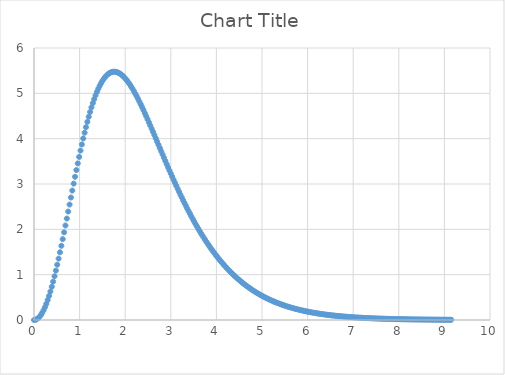
| Category | Series 0 |
|---|---|
| 0.0 | 0 |
| 0.03 | 0.004 |
| 0.06 | 0.017 |
| 0.09 | 0.039 |
| 0.12 | 0.07 |
| 0.15 | 0.11 |
| 0.18 | 0.159 |
| 0.21 | 0.216 |
| 0.24 | 0.282 |
| 0.27 | 0.357 |
| 0.30000000000000004 | 0.44 |
| 0.33000000000000007 | 0.53 |
| 0.3600000000000001 | 0.628 |
| 0.3900000000000001 | 0.734 |
| 0.42000000000000015 | 0.846 |
| 0.4500000000000002 | 0.965 |
| 0.4800000000000002 | 1.089 |
| 0.5100000000000002 | 1.219 |
| 0.5400000000000003 | 1.354 |
| 0.5700000000000003 | 1.494 |
| 0.6000000000000003 | 1.637 |
| 0.6300000000000003 | 1.784 |
| 0.6600000000000004 | 1.933 |
| 0.6900000000000004 | 2.085 |
| 0.7200000000000004 | 2.238 |
| 0.7500000000000004 | 2.392 |
| 0.7800000000000005 | 2.547 |
| 0.8100000000000005 | 2.701 |
| 0.8400000000000005 | 2.855 |
| 0.8700000000000006 | 3.008 |
| 0.9000000000000006 | 3.159 |
| 0.9300000000000006 | 3.308 |
| 0.9600000000000006 | 3.454 |
| 0.9900000000000007 | 3.597 |
| 1.0200000000000007 | 3.737 |
| 1.0500000000000007 | 3.873 |
| 1.0800000000000007 | 4.004 |
| 1.1100000000000008 | 4.131 |
| 1.1400000000000008 | 4.254 |
| 1.1700000000000008 | 4.371 |
| 1.2000000000000008 | 4.482 |
| 1.2300000000000009 | 4.588 |
| 1.260000000000001 | 4.689 |
| 1.290000000000001 | 4.783 |
| 1.320000000000001 | 4.872 |
| 1.350000000000001 | 4.954 |
| 1.380000000000001 | 5.031 |
| 1.410000000000001 | 5.101 |
| 1.440000000000001 | 5.165 |
| 1.470000000000001 | 5.223 |
| 1.500000000000001 | 5.274 |
| 1.5300000000000011 | 5.32 |
| 1.5600000000000012 | 5.359 |
| 1.5900000000000012 | 5.393 |
| 1.6200000000000012 | 5.421 |
| 1.6500000000000012 | 5.443 |
| 1.6800000000000013 | 5.459 |
| 1.7100000000000013 | 5.47 |
| 1.7400000000000013 | 5.476 |
| 1.7700000000000014 | 5.477 |
| 1.8000000000000014 | 5.472 |
| 1.8300000000000014 | 5.463 |
| 1.8600000000000014 | 5.45 |
| 1.8900000000000015 | 5.431 |
| 1.9200000000000015 | 5.409 |
| 1.9500000000000015 | 5.383 |
| 1.9800000000000015 | 5.353 |
| 2.0100000000000016 | 5.319 |
| 2.0400000000000014 | 5.281 |
| 2.070000000000001 | 5.241 |
| 2.100000000000001 | 5.197 |
| 2.130000000000001 | 5.15 |
| 2.1600000000000006 | 5.101 |
| 2.1900000000000004 | 5.049 |
| 2.22 | 4.995 |
| 2.25 | 4.939 |
| 2.28 | 4.881 |
| 2.3099999999999996 | 4.82 |
| 2.3399999999999994 | 4.759 |
| 2.369999999999999 | 4.695 |
| 2.399999999999999 | 4.63 |
| 2.429999999999999 | 4.564 |
| 2.4599999999999986 | 4.497 |
| 2.4899999999999984 | 4.429 |
| 2.5199999999999982 | 4.36 |
| 2.549999999999998 | 4.291 |
| 2.579999999999998 | 4.221 |
| 2.6099999999999977 | 4.15 |
| 2.6399999999999975 | 4.079 |
| 2.6699999999999973 | 4.008 |
| 2.699999999999997 | 3.936 |
| 2.729999999999997 | 3.865 |
| 2.7599999999999967 | 3.793 |
| 2.7899999999999965 | 3.722 |
| 2.8199999999999963 | 3.65 |
| 2.849999999999996 | 3.579 |
| 2.879999999999996 | 3.509 |
| 2.9099999999999957 | 3.438 |
| 2.9399999999999955 | 3.368 |
| 2.9699999999999953 | 3.299 |
| 2.999999999999995 | 3.23 |
| 3.029999999999995 | 3.162 |
| 3.0599999999999947 | 3.094 |
| 3.0899999999999945 | 3.027 |
| 3.1199999999999943 | 2.961 |
| 3.149999999999994 | 2.895 |
| 3.179999999999994 | 2.831 |
| 3.2099999999999937 | 2.767 |
| 3.2399999999999936 | 2.704 |
| 3.2699999999999934 | 2.641 |
| 3.299999999999993 | 2.58 |
| 3.329999999999993 | 2.52 |
| 3.3599999999999928 | 2.46 |
| 3.3899999999999926 | 2.401 |
| 3.4199999999999924 | 2.344 |
| 3.449999999999992 | 2.287 |
| 3.479999999999992 | 2.231 |
| 3.509999999999992 | 2.176 |
| 3.5399999999999916 | 2.122 |
| 3.5699999999999914 | 2.069 |
| 3.599999999999991 | 2.018 |
| 3.629999999999991 | 1.967 |
| 3.659999999999991 | 1.917 |
| 3.6899999999999906 | 1.868 |
| 3.7199999999999904 | 1.82 |
| 3.7499999999999902 | 1.772 |
| 3.77999999999999 | 1.726 |
| 3.80999999999999 | 1.681 |
| 3.8399999999999896 | 1.637 |
| 3.8699999999999894 | 1.594 |
| 3.8999999999999893 | 1.551 |
| 3.929999999999989 | 1.51 |
| 3.959999999999989 | 1.469 |
| 3.9899999999999887 | 1.429 |
| 4.019999999999989 | 1.391 |
| 4.049999999999989 | 1.353 |
| 4.079999999999989 | 1.316 |
| 4.10999999999999 | 1.28 |
| 4.13999999999999 | 1.244 |
| 4.16999999999999 | 1.21 |
| 4.19999999999999 | 1.176 |
| 4.229999999999991 | 1.143 |
| 4.259999999999991 | 1.111 |
| 4.289999999999991 | 1.08 |
| 4.319999999999991 | 1.049 |
| 4.349999999999992 | 1.02 |
| 4.379999999999992 | 0.991 |
| 4.409999999999992 | 0.962 |
| 4.439999999999992 | 0.935 |
| 4.469999999999993 | 0.908 |
| 4.499999999999993 | 0.882 |
| 4.529999999999993 | 0.856 |
| 4.559999999999993 | 0.831 |
| 4.589999999999994 | 0.807 |
| 4.619999999999994 | 0.783 |
| 4.649999999999994 | 0.76 |
| 4.679999999999994 | 0.738 |
| 4.709999999999995 | 0.716 |
| 4.739999999999995 | 0.695 |
| 4.769999999999995 | 0.674 |
| 4.799999999999995 | 0.654 |
| 4.829999999999996 | 0.635 |
| 4.859999999999996 | 0.616 |
| 4.889999999999996 | 0.597 |
| 4.919999999999996 | 0.579 |
| 4.949999999999997 | 0.562 |
| 4.979999999999997 | 0.545 |
| 5.009999999999997 | 0.529 |
| 5.039999999999997 | 0.512 |
| 5.069999999999998 | 0.497 |
| 5.099999999999998 | 0.482 |
| 5.129999999999998 | 0.467 |
| 5.159999999999998 | 0.453 |
| 5.189999999999999 | 0.439 |
| 5.219999999999999 | 0.425 |
| 5.249999999999999 | 0.412 |
| 5.279999999999999 | 0.399 |
| 5.31 | 0.387 |
| 5.34 | 0.375 |
| 5.37 | 0.363 |
| 5.4 | 0.352 |
| 5.430000000000001 | 0.341 |
| 5.460000000000001 | 0.33 |
| 5.490000000000001 | 0.32 |
| 5.520000000000001 | 0.31 |
| 5.550000000000002 | 0.3 |
| 5.580000000000002 | 0.291 |
| 5.610000000000002 | 0.282 |
| 5.640000000000002 | 0.273 |
| 5.670000000000003 | 0.264 |
| 5.700000000000003 | 0.256 |
| 5.730000000000003 | 0.247 |
| 5.760000000000003 | 0.24 |
| 5.790000000000004 | 0.232 |
| 5.820000000000004 | 0.225 |
| 5.850000000000004 | 0.217 |
| 5.880000000000004 | 0.21 |
| 5.910000000000005 | 0.204 |
| 5.940000000000005 | 0.197 |
| 5.970000000000005 | 0.191 |
| 6.000000000000005 | 0.185 |
| 6.030000000000006 | 0.179 |
| 6.060000000000006 | 0.173 |
| 6.090000000000006 | 0.167 |
| 6.120000000000006 | 0.162 |
| 6.150000000000007 | 0.156 |
| 6.180000000000007 | 0.151 |
| 6.210000000000007 | 0.146 |
| 6.240000000000007 | 0.142 |
| 6.270000000000008 | 0.137 |
| 6.300000000000008 | 0.133 |
| 6.330000000000008 | 0.128 |
| 6.360000000000008 | 0.124 |
| 6.390000000000009 | 0.12 |
| 6.420000000000009 | 0.116 |
| 6.450000000000009 | 0.112 |
| 6.480000000000009 | 0.108 |
| 6.51000000000001 | 0.105 |
| 6.54000000000001 | 0.101 |
| 6.57000000000001 | 0.098 |
| 6.60000000000001 | 0.095 |
| 6.6300000000000106 | 0.092 |
| 6.660000000000011 | 0.089 |
| 6.690000000000011 | 0.086 |
| 6.720000000000011 | 0.083 |
| 6.7500000000000115 | 0.08 |
| 6.780000000000012 | 0.077 |
| 6.810000000000012 | 0.075 |
| 6.840000000000012 | 0.072 |
| 6.8700000000000125 | 0.07 |
| 6.900000000000013 | 0.067 |
| 6.930000000000013 | 0.065 |
| 6.960000000000013 | 0.063 |
| 6.9900000000000135 | 0.061 |
| 7.020000000000014 | 0.059 |
| 7.050000000000014 | 0.057 |
| 7.080000000000014 | 0.055 |
| 7.1100000000000145 | 0.053 |
| 7.140000000000015 | 0.051 |
| 7.170000000000015 | 0.05 |
| 7.200000000000015 | 0.048 |
| 7.2300000000000155 | 0.046 |
| 7.260000000000016 | 0.045 |
| 7.290000000000016 | 0.043 |
| 7.320000000000016 | 0.042 |
| 7.3500000000000165 | 0.04 |
| 7.380000000000017 | 0.039 |
| 7.410000000000017 | 0.038 |
| 7.440000000000017 | 0.036 |
| 7.4700000000000175 | 0.035 |
| 7.500000000000018 | 0.034 |
| 7.530000000000018 | 0.033 |
| 7.560000000000018 | 0.032 |
| 7.5900000000000185 | 0.03 |
| 7.620000000000019 | 0.029 |
| 7.650000000000019 | 0.028 |
| 7.680000000000019 | 0.027 |
| 7.7100000000000195 | 0.026 |
| 7.74000000000002 | 0.026 |
| 7.77000000000002 | 0.025 |
| 7.80000000000002 | 0.024 |
| 7.8300000000000205 | 0.023 |
| 7.860000000000021 | 0.022 |
| 7.890000000000021 | 0.021 |
| 7.920000000000021 | 0.021 |
| 7.9500000000000215 | 0.02 |
| 7.980000000000022 | 0.019 |
| 8.010000000000021 | 0.019 |
| 8.04000000000002 | 0.018 |
| 8.07000000000002 | 0.017 |
| 8.10000000000002 | 0.017 |
| 8.130000000000019 | 0.016 |
| 8.160000000000018 | 0.016 |
| 8.190000000000017 | 0.015 |
| 8.220000000000017 | 0.015 |
| 8.250000000000016 | 0.014 |
| 8.280000000000015 | 0.014 |
| 8.310000000000015 | 0.013 |
| 8.340000000000014 | 0.013 |
| 8.370000000000013 | 0.012 |
| 8.400000000000013 | 0.012 |
| 8.430000000000012 | 0.011 |
| 8.460000000000012 | 0.011 |
| 8.49000000000001 | 0.011 |
| 8.52000000000001 | 0.01 |
| 8.55000000000001 | 0.01 |
| 8.580000000000009 | 0.009 |
| 8.610000000000008 | 0.009 |
| 8.640000000000008 | 0.009 |
| 8.670000000000007 | 0.008 |
| 8.700000000000006 | 0.008 |
| 8.730000000000006 | 0.008 |
| 8.760000000000005 | 0.008 |
| 8.790000000000004 | 0.007 |
| 8.820000000000004 | 0.007 |
| 8.850000000000003 | 0.007 |
| 8.880000000000003 | 0.007 |
| 8.910000000000002 | 0.006 |
| 8.940000000000001 | 0.006 |
| 8.97 | 0.006 |
| 9.0 | 0.006 |
| 9.03 | 0.006 |
| 9.059999999999999 | 0.005 |
| 9.089999999999998 | 0.005 |
| 9.119999999999997 | 0.005 |
| 9.149999999999997 | 0.005 |